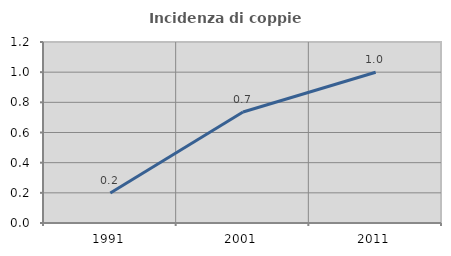
| Category | Incidenza di coppie miste |
|---|---|
| 1991.0 | 0.199 |
| 2001.0 | 0.736 |
| 2011.0 | 0.999 |